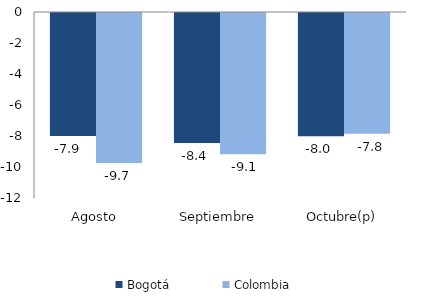
| Category | Bogotá | Colombia |
|---|---|---|
| Agosto | -7.934 | -9.67 |
| Septiembre | -8.38 | -9.108 |
| Octubre(p) | -7.957 | -7.786 |